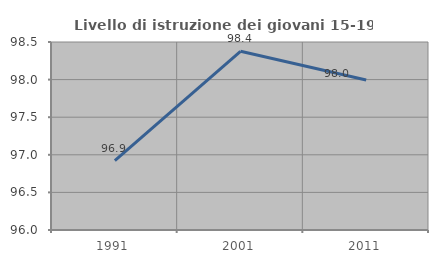
| Category | Livello di istruzione dei giovani 15-19 anni |
|---|---|
| 1991.0 | 96.923 |
| 2001.0 | 98.377 |
| 2011.0 | 97.994 |